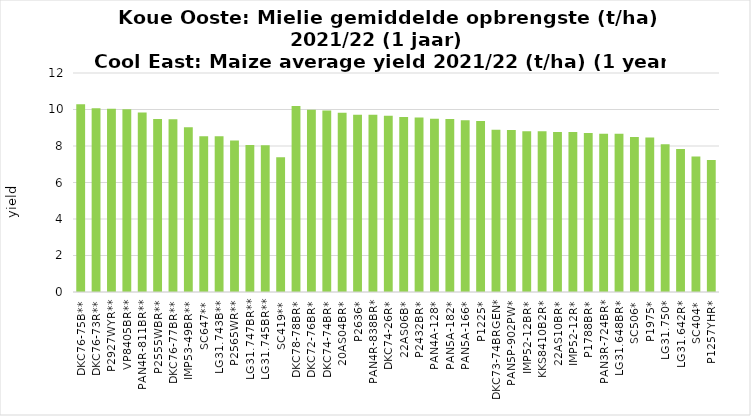
| Category | Series 0 |
|---|---|
| DKC76-75B** | 10.282 |
| DKC76-73R** | 10.072 |
| P2927WYR** | 10.04 |
| VP8405BR** | 10.018 |
| PAN4R-811BR** | 9.84 |
| P2555WBR** | 9.48 |
| DKC76-77BR** | 9.466 |
| IMP53-49BR** | 9.03 |
| SC647** | 8.54 |
| LG31.743B** | 8.536 |
| P2565WR** | 8.302 |
| LG31.747BR** | 8.06 |
| LG31.745BR** | 8.042 |
| SC419** | 7.378 |
| DKC78-78BR* | 10.192 |
| DKC72-76BR* | 9.98 |
| DKC74-74BR* | 9.952 |
| 20AS04BR* | 9.818 |
| P2636* | 9.716 |
| PAN4R-838BR* | 9.716 |
| DKC74-26R* | 9.652 |
| 22AS06B* | 9.586 |
| P2432BR* | 9.558 |
| PAN4A-128* | 9.49 |
| PAN5A-182* | 9.474 |
| PAN5A-166* | 9.412 |
| P1225* | 9.366 |
| DKC73-74BRGEN* | 8.896 |
| PAN5P-902PW* | 8.87 |
| IMP52-12BR* | 8.804 |
| KKS8410B2R* | 8.802 |
| 22AS10BR* | 8.77 |
| IMP52-12R* | 8.762 |
| P1788BR* | 8.714 |
| PAN3R-724BR* | 8.676 |
| LG31.648BR* | 8.674 |
| SC506* | 8.492 |
| P1975* | 8.468 |
| LG31.750* | 8.096 |
| LG31.642R* | 7.836 |
| SC404* | 7.418 |
| P1257YHR* | 7.232 |